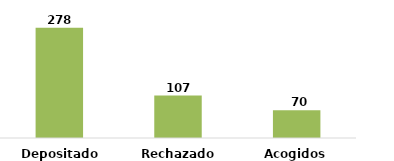
| Category | Series 0 |
|---|---|
| Depositados | 278 |
| Rechazados | 107 |
| Acogidos | 70 |